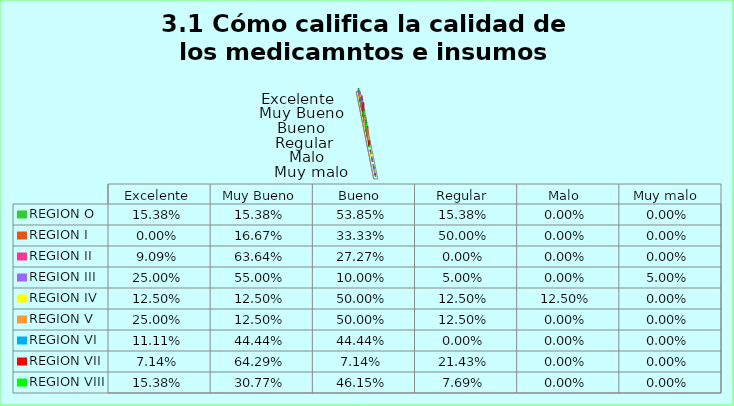
| Category | REGION O | REGION I  | REGION II | REGION III | REGION IV | REGION V  | REGION VI  | REGION VII  | REGION VIII |
|---|---|---|---|---|---|---|---|---|---|
| Excelente | 0.154 | 0 | 0.091 | 0.25 | 0.125 | 0.25 | 0.111 | 0.071 | 0.154 |
| Muy Bueno | 0.154 | 0.167 | 0.636 | 0.55 | 0.125 | 0.125 | 0.444 | 0.643 | 0.308 |
| Bueno  | 0.538 | 0.333 | 0.273 | 0.1 | 0.5 | 0.5 | 0.444 | 0.071 | 0.462 |
| Regular  | 0.154 | 0.5 | 0 | 0.05 | 0.125 | 0.125 | 0 | 0.214 | 0.077 |
| Malo  | 0 | 0 | 0 | 0 | 0.125 | 0 | 0 | 0 | 0 |
| Muy malo  | 0 | 0 | 0 | 0.05 | 0 | 0 | 0 | 0 | 0 |